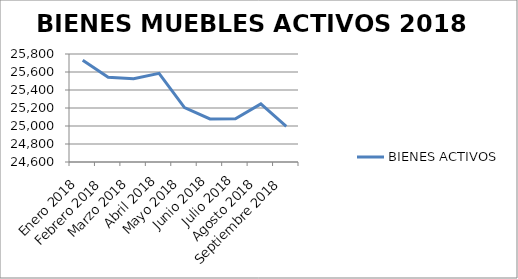
| Category | BIENES ACTIVOS |
|---|---|
| Enero 2018 | 25731 |
| Febrero 2018 | 25541 |
| Marzo 2018 | 25524 |
| Abril 2018 | 25585 |
| Mayo 2018 | 25204 |
| Junio 2018 | 25079 |
| Julio 2018 | 25080 |
| Agosto 2018 | 25245 |
| Septiembre 2018 | 24997 |